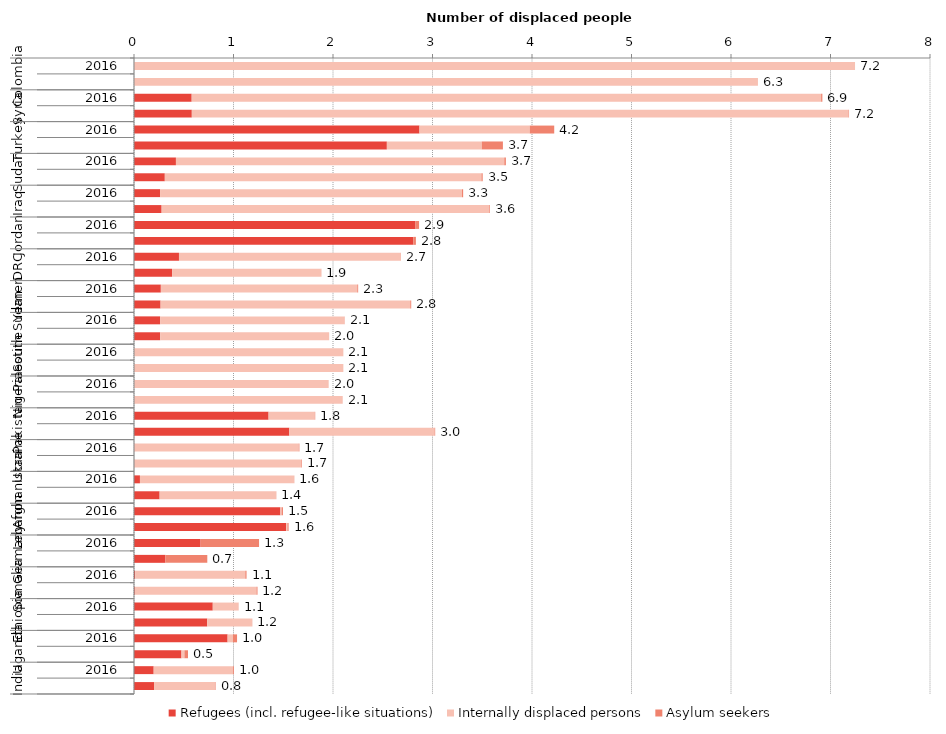
| Category | Refugees (incl. refugee-like situations) | Internally displaced persons | Asylum seekers | Series 3 |
|---|---|---|---|---|
| 0 | 0 | 7.246 | 0 | 7.246 |
| 1 | 0 | 6.27 | 0 | 6.271 |
| 2 | 0.58 | 6.326 | 0.012 | 6.918 |
| 3 | 0.581 | 6.6 | 0.005 | 7.186 |
| 4 | 2.869 | 1.108 | 0.246 | 4.223 |
| 5 | 2.541 | 0.954 | 0.212 | 3.708 |
| 6 | 0.421 | 3.3 | 0.016 | 3.738 |
| 7 | 0.31 | 3.182 | 0.013 | 3.504 |
| 8 | 0.262 | 3.035 | 0.011 | 3.308 |
| 9 | 0.278 | 3.29 | 0.007 | 3.575 |
| 10 | 2.829 | 0 | 0.036 | 2.865 |
| 11 | 2.808 | 0 | 0.025 | 2.833 |
| 12 | 0.452 | 2.23 | 0.001 | 2.683 |
| 13 | 0.383 | 1.5 | 0.001 | 1.884 |
| 14 | 0.27 | 1.974 | 0.009 | 2.253 |
| 15 | 0.267 | 2.509 | 0.01 | 2.786 |
| 16 | 0.263 | 1.854 | 0.002 | 2.118 |
| 17 | 0.263 | 1.697 | 0.001 | 1.961 |
| 18 | 0 | 2.104 | 0 | 2.104 |
| 19 | 0 | 2.104 | 0 | 2.104 |
| 20 | 0.001 | 1.955 | 0 | 1.956 |
| 21 | 0.001 | 2.096 | 0 | 2.098 |
| 22 | 1.353 | 0.464 | 0.005 | 1.821 |
| 23 | 1.561 | 1.459 | 0.006 | 3.027 |
| 24 | 0.003 | 1.653 | 0.007 | 1.662 |
| 25 | 0.003 | 1.679 | 0.006 | 1.688 |
| 26 | 0.06 | 1.553 | 0 | 1.613 |
| 27 | 0.258 | 1.174 | 0 | 1.432 |
| 28 | 1.471 | 0.012 | 0.014 | 1.497 |
| 29 | 1.529 | 0.012 | 0.012 | 1.554 |
| 30 | 0.669 | 0 | 0.587 | 1.257 |
| 31 | 0.316 | 0 | 0.421 | 0.737 |
| 32 | 0.012 | 1.107 | 0.013 | 1.131 |
| 33 | 0.008 | 1.223 | 0.01 | 1.241 |
| 34 | 0.792 | 0.258 | 0.002 | 1.051 |
| 35 | 0.736 | 0.45 | 0.002 | 1.188 |
| 36 | 0.941 | 0.053 | 0.042 | 1.036 |
| 37 | 0.477 | 0.03 | 0.036 | 0.543 |
| 38 | 0.198 | 0.796 | 0.009 | 1.003 |
| 39 | 0.201 | 0.612 | 0.006 | 0.82 |